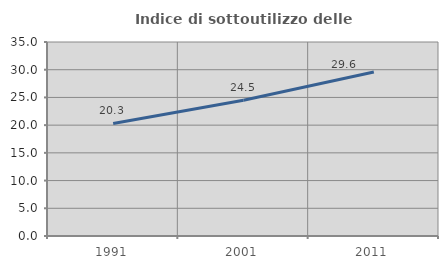
| Category | Indice di sottoutilizzo delle abitazioni  |
|---|---|
| 1991.0 | 20.307 |
| 2001.0 | 24.504 |
| 2011.0 | 29.604 |